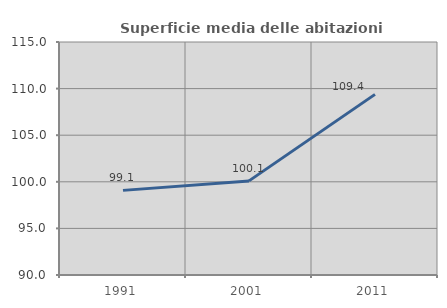
| Category | Superficie media delle abitazioni occupate |
|---|---|
| 1991.0 | 99.08 |
| 2001.0 | 100.098 |
| 2011.0 | 109.379 |